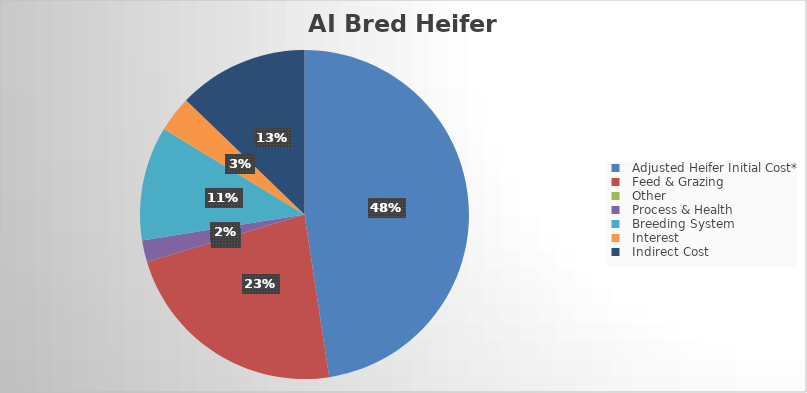
| Category | Series 0 |
|---|---|
|   Adjusted Heifer Initial Cost* | 645.856 |
|   Feed & Grazing  | 308.623 |
|   Other | 0 |
|   Process & Health | 28.935 |
|   Breeding System | 152.15 |
|   Interest  | 47.782 |
|   Indirect Cost | 173.514 |